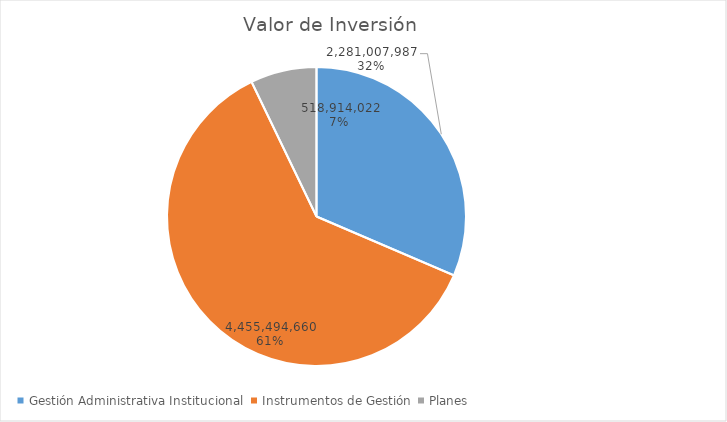
| Category | Valor de Inversión | Porcentaje de Ejecución dentro de la Actividad |
|---|---|---|
| Gestión Administrativa Institucional | 2281007987 | 7 |
| Instrumentos de Gestión | 4455494660 | 14 |
| Planes | 518914022 | 5 |